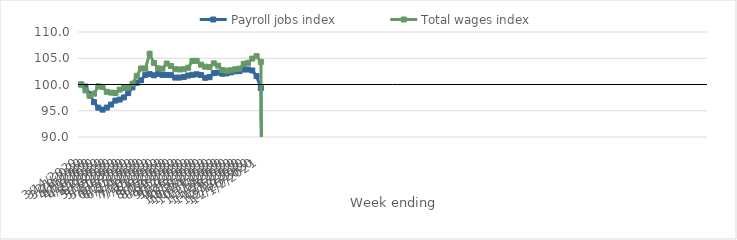
| Category | Payroll jobs index | Total wages index |
|---|---|---|
| 14/03/2020 | 100 | 100 |
| 21/03/2020 | 99.603 | 98.874 |
| 28/03/2020 | 98.169 | 97.825 |
| 04/04/2020 | 96.647 | 98.248 |
| 11/04/2020 | 95.586 | 99.652 |
| 18/04/2020 | 95.208 | 99.531 |
| 25/04/2020 | 95.603 | 98.603 |
| 02/05/2020 | 96.176 | 98.45 |
| 09/05/2020 | 96.94 | 98.38 |
| 16/05/2020 | 97.129 | 99.025 |
| 23/05/2020 | 97.538 | 99.327 |
| 30/05/2020 | 98.361 | 99.403 |
| 06/06/2020 | 99.454 | 100.146 |
| 13/06/2020 | 100.334 | 101.65 |
| 20/06/2020 | 100.805 | 103.058 |
| 27/06/2020 | 101.842 | 103.024 |
| 04/07/2020 | 101.983 | 105.84 |
| 11/07/2020 | 101.756 | 104.112 |
| 18/07/2020 | 102.03 | 103.065 |
| 25/07/2020 | 101.823 | 103.006 |
| 01/08/2020 | 101.829 | 103.994 |
| 08/08/2020 | 101.788 | 103.518 |
| 15/08/2020 | 101.317 | 102.915 |
| 22/08/2020 | 101.322 | 102.867 |
| 29/08/2020 | 101.443 | 102.905 |
| 05/09/2020 | 101.706 | 103.19 |
| 12/09/2020 | 101.847 | 104.478 |
| 19/09/2020 | 101.946 | 104.509 |
| 26/09/2020 | 101.817 | 103.786 |
| 03/10/2020 | 101.277 | 103.392 |
| 10/10/2020 | 101.393 | 103.319 |
| 17/10/2020 | 102.163 | 104.034 |
| 24/10/2020 | 102.264 | 103.596 |
| 31/10/2020 | 102.054 | 102.761 |
| 07/11/2020 | 102.122 | 102.637 |
| 14/11/2020 | 102.323 | 102.713 |
| 21/11/2020 | 102.503 | 102.895 |
| 28/11/2020 | 102.548 | 103.014 |
| 05/12/2020 | 102.851 | 103.922 |
| 12/12/2020 | 102.858 | 104.134 |
| 19/12/2020 | 102.672 | 104.934 |
| 26/12/2020 | 101.595 | 105.402 |
| 02/01/2021 | 99.336 | 104.296 |